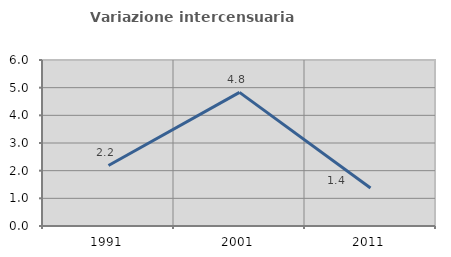
| Category | Variazione intercensuaria annua |
|---|---|
| 1991.0 | 2.189 |
| 2001.0 | 4.829 |
| 2011.0 | 1.376 |